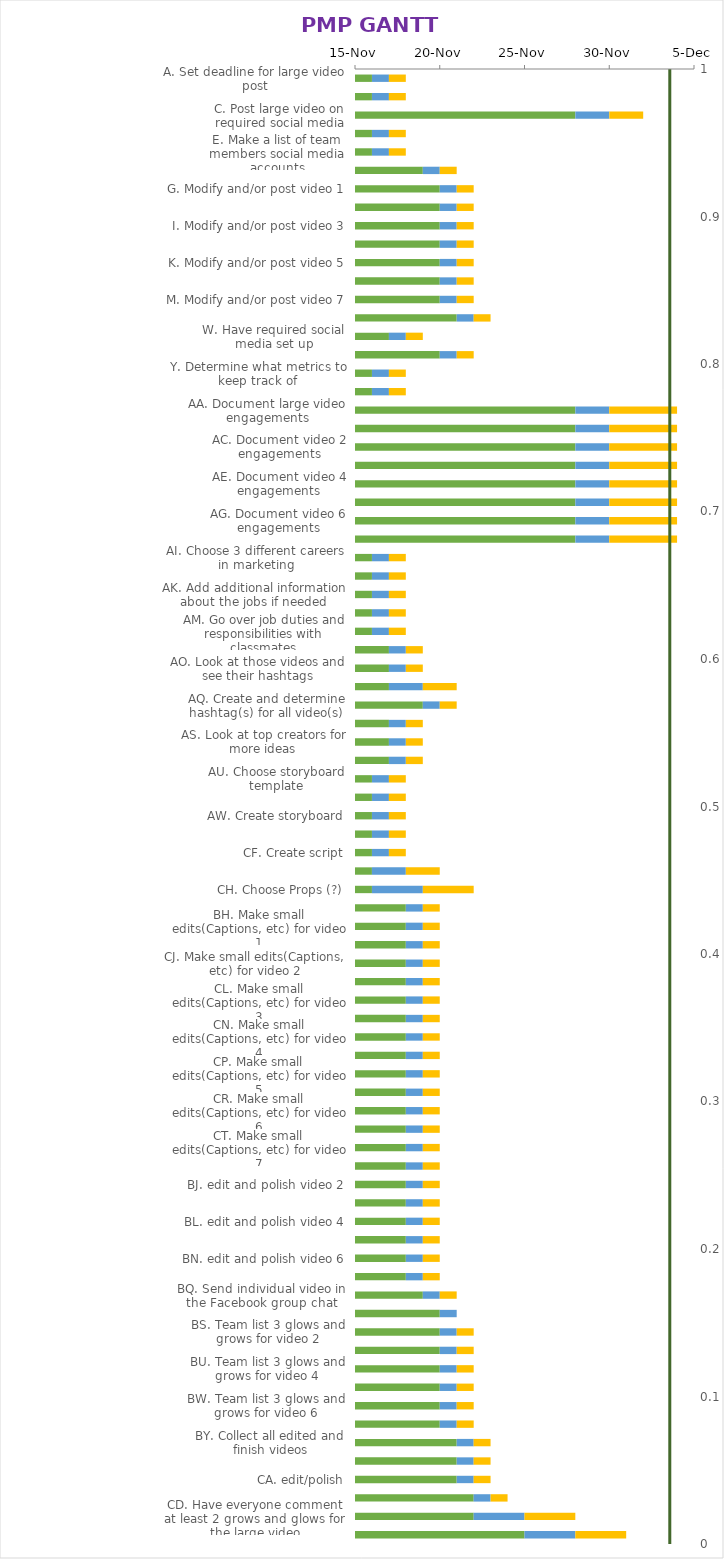
| Category | START DATE | DURATION | COMPLETE |
|---|---|---|---|
| A. Set deadline for large video post | 2020-11-16 | 1 | 1 |
| B. Specify with group where to post final video | 2020-11-16 | 1 | 1 |
| C. Post large video on required social media | 2020-11-28 | 2 | 2 |
| D. Set deadline for posting | 2020-11-16 | 1 | 1 |
| E. Make a list of team members social media accounts | 2020-11-16 | 1 | 1 |
| F. Set meeting time to discuss video quality | 2020-11-19 | 1 | 1 |
| G. Modify and/or post video 1 | 2020-11-20 | 1 | 1 |
| H. Modify and/or post video 2 | 2020-11-20 | 1 | 1 |
| I. Modify and/or post video 3 | 2020-11-20 | 1 | 1 |
| J. Modify and/or post video 4 | 2020-11-20 | 1 | 1 |
| K. Modify and/or post video 5 | 2020-11-20 | 1 | 1 |
| L. Modify and/or post video 6 | 2020-11-20 | 1 | 1 |
| M. Modify and/or post video 7 | 2020-11-20 | 1 | 1 |
| N. Verify all 7 videos are posted | 2020-11-21 | 1 | 1 |
| W. Have required social media set up | 2020-11-17 | 1 | 1 |
| X. Request access to Western Technical College marketing page | 2020-11-20 | 1 | 1 |
| Y. Determine what metrics to keep track of | 2020-11-16 | 1 | 1 |
| Z. Create a schedule to monitor metrics | 2020-11-16 | 1 | 1 |
| AA. Document large video engagements | 2020-11-28 | 2 | 4 |
| AB. Document video 1 engagements | 2020-11-28 | 2 | 4 |
| AC. Document video 2 engagements | 2020-11-28 | 2 | 4 |
| AD. Document video 3 engagements | 2020-11-28 | 2 | 4 |
| AE. Document video 4 engagements | 2020-11-28 | 2 | 4 |
| AF. Document video 5 engagements | 2020-11-28 | 2 | 4 |
| AG. Document video 6 engagements | 2020-11-28 | 2 | 4 |
| AH. Document video 7 engagements | 2020-11-28 | 2 | 4 |
| AI. Choose 3 different careers in marketing | 2020-11-16 | 1 | 1 |
| AJ. Write the job description and responsibilities for all 3 | 2020-11-16 | 1 | 1 |
| AK. Add additional information about the jobs if needed | 2020-11-16 | 1 | 1 |
| AL. Choose 1 of the 3 jobs and discuss with everyone else | 2020-11-16 | 1 | 1 |
| AM. Go over job duties and responsibilities with classmates | 2020-11-16 | 1 | 1 |
| AN. Go on Tiktok and watch some videos on your “for you” page | 2020-11-17 | 1 | 1 |
| AO. Look at those videos and see their hashtags | 2020-11-17 | 1 | 1 |
| AP. Record hashtags you think will help you with your video | 2020-11-17 | 2 | 2 |
| AQ. Create and determine hashtag(s) for all video(s) | 2020-11-19 | 1 | 1 |
| AR. ResearchTikTok and learn how to use | 2020-11-17 | 1 | 1 |
| AS. Look at top creators for more ideas | 2020-11-17 | 1 | 1 |
| AT. Download and set up TikTok | 2020-11-17 | 1 | 1 |
| AU. Choose storyboard template | 2020-11-16 | 1 | 1 |
| AV. Discuss and agree upon storyboard sections/content with team | 2020-11-16 | 1 | 1 |
| AW. Create storyboard | 2020-11-16 | 1 | 1 |
| AX. Discuss and agree upon a consistent format with team | 2020-11-16 | 1 | 1 |
| CF. Create script | 2020-11-16 | 1 | 1 |
| CG. Choose Music (?) | 2020-11-16 | 2 | 2 |
| CH. Choose Props (?) | 2020-11-16 | 3 | 3 |
| BG. Create Video 1 | 2020-11-18 | 1 | 1 |
| BH. Make small edits(Captions, etc) for video 1 | 2020-11-18 | 1 | 1 |
| CI. Create Video 2 | 2020-11-18 | 1 | 1 |
| CJ. Make small edits(Captions, etc) for video 2 | 2020-11-18 | 1 | 1 |
| CK. Create Video 3 | 2020-11-18 | 1 | 1 |
| CL. Make small edits(Captions, etc) for video 3 | 2020-11-18 | 1 | 1 |
| CM. Create Video 4 | 2020-11-18 | 1 | 1 |
| CN. Make small edits(Captions, etc) for video 4 | 2020-11-18 | 1 | 1 |
| CO. Create Video 5 | 2020-11-18 | 1 | 1 |
| CP. Make small edits(Captions, etc) for video 5 | 2020-11-18 | 1 | 1 |
| CQ. Create Video 6 | 2020-11-18 | 1 | 1 |
| CR. Make small edits(Captions, etc) for video 6 | 2020-11-18 | 1 | 1 |
| CS. Create Video 7 | 2020-11-18 | 1 | 1 |
| CT. Make small edits(Captions, etc) for video 7 | 2020-11-18 | 1 | 1 |
| BI. edit and polish video 1 | 2020-11-18 | 1 | 1 |
| BJ. edit and polish video 2 | 2020-11-18 | 1 | 1 |
| BK. edit and polish video 3 | 2020-11-18 | 1 | 1 |
| BL. edit and polish video 4 | 2020-11-18 | 1 | 1 |
| BM. edit and polish video 5 | 2020-11-18 | 1 | 1 |
| BN. edit and polish video 6 | 2020-11-18 | 1 | 1 |
| BO. edit and polish video 7 | 2020-11-18 | 1 | 1 |
| BQ. Send individual video in the Facebook group chat | 2020-11-19 | 1 | 1 |
| BR. Team list 3 glows and grows for video 1 | 2020-11-20 | 1 | 0 |
| BS. Team list 3 glows and grows for video 2 | 2020-11-20 | 1 | 1 |
| BT. Team list 3 glows and grows for video 3 | 2020-11-20 | 1 | 1 |
| BU. Team list 3 glows and grows for video 4 | 2020-11-20 | 1 | 1 |
| BV. Team list 3 glows and grows for video 5 | 2020-11-20 | 1 | 1 |
| BW. Team list 3 glows and grows for video 6 | 2020-11-20 | 1 | 1 |
| BX. Team list 3 glows and grows for video 7 | 2020-11-20 | 1 | 1 |
| BY. Collect all edited and finish videos | 2020-11-21 | 1 | 1 |
| BZ. Format large video according to requirements | 2020-11-21 | 1 | 1 |
| CA. edit/polish | 2020-11-21 | 1 | 1 |
| CB. Send video to group | 2020-11-22 | 1 | 1 |
| CD. Have everyone comment at least 2 grows and glows for the large video | 2020-11-22 | 3 | 3 |
| CE. Send video back to editor(Duncan) to finalize | 2020-11-25 | 3 | 3 |